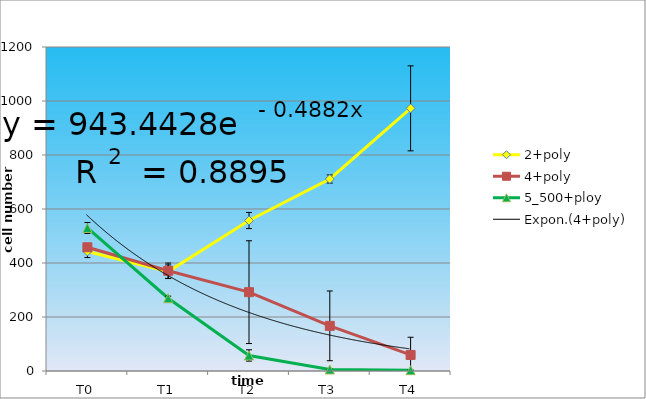
| Category | 2+poly | 4+poly | 5_500+ploy |
|---|---|---|---|
| T0 | 442.667 | 458.222 | 529.778 |
| T1 | 368 | 371.111 | 269.556 |
| T2 | 557.333 | 292 | 57.556 |
| T3 | 711.111 | 167.222 | 5.667 |
| T4 | 972.778 | 59.444 | 3 |